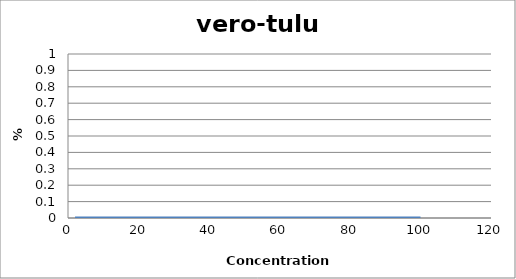
| Category | vero-tulu4 |
|---|---|
| 100.0 | 0 |
| 50.0 | 0 |
| 20.0 | 0 |
| 2.0 | 0 |
| nan | 0 |
| nan | 0 |
| nan | 0 |
| nan | 0 |
| nan | 0 |